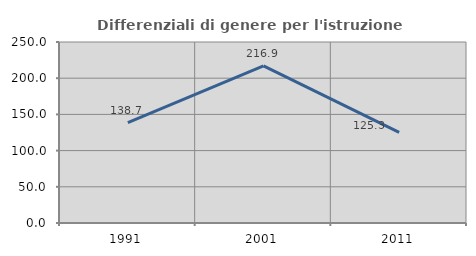
| Category | Differenziali di genere per l'istruzione superiore |
|---|---|
| 1991.0 | 138.739 |
| 2001.0 | 216.941 |
| 2011.0 | 125.307 |